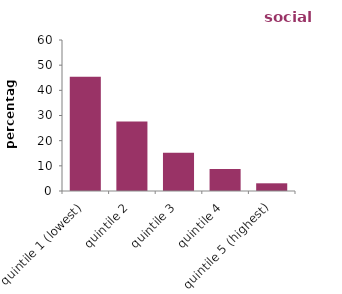
| Category | social renters |
|---|---|
| quintile 1 (lowest) | 45.387 |
| quintile 2 | 27.604 |
| quintile 3 | 15.217 |
| quintile 4 | 8.733 |
| quintile 5 (highest) | 3.059 |